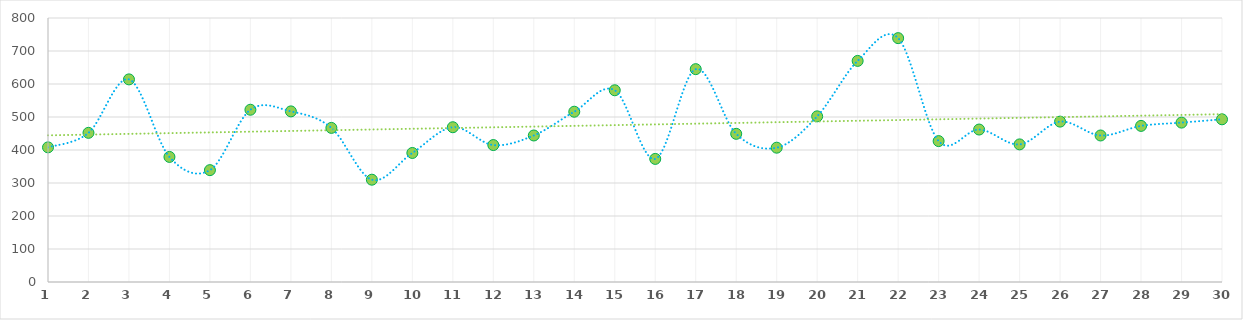
| Category | Series 0 |
|---|---|
| 1.0 | 408 |
| 2.0 | 452 |
| 3.0 | 614 |
| 4.0 | 379 |
| 5.0 | 339 |
| 6.0 | 522 |
| 7.0 | 517 |
| 8.0 | 467 |
| 9.0 | 310 |
| 10.0 | 391 |
| 11.0 | 469 |
| 12.0 | 415 |
| 13.0 | 444 |
| 14.0 | 516 |
| 15.0 | 581 |
| 16.0 | 373 |
| 17.0 | 645 |
| 18.0 | 449 |
| 19.0 | 407 |
| 20.0 | 502 |
| 21.0 | 670 |
| 22.0 | 739 |
| 23.0 | 427 |
| 24.0 | 462 |
| 25.0 | 417 |
| 26.0 | 486 |
| 27.0 | 444 |
| 28.0 | 473 |
| 29.0 | 483 |
| 30.0 | 493 |